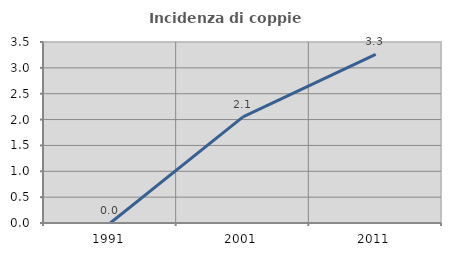
| Category | Incidenza di coppie miste |
|---|---|
| 1991.0 | 0 |
| 2001.0 | 2.051 |
| 2011.0 | 3.261 |